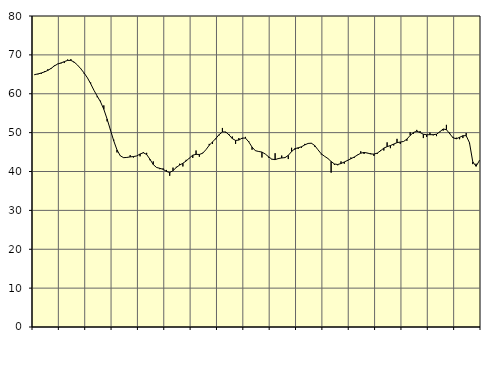
| Category | Piggar | Series 1 |
|---|---|---|
| nan | 64.8 | 64.93 |
| 87.0 | 65 | 65.1 |
| 87.0 | 65.1 | 65.34 |
| 87.0 | 65.8 | 65.62 |
| nan | 66.3 | 66 |
| 88.0 | 66.4 | 66.53 |
| 88.0 | 67.3 | 67.17 |
| 88.0 | 67.7 | 67.65 |
| nan | 67.8 | 67.93 |
| 89.0 | 67.9 | 68.26 |
| 89.0 | 68.8 | 68.58 |
| 89.0 | 68.9 | 68.58 |
| nan | 68 | 68.15 |
| 90.0 | 67.4 | 67.39 |
| 90.0 | 66.5 | 66.44 |
| 90.0 | 65.2 | 65.36 |
| nan | 64.1 | 64.13 |
| 91.0 | 62.9 | 62.59 |
| 91.0 | 60.9 | 60.89 |
| 91.0 | 59.1 | 59.38 |
| nan | 58.2 | 57.92 |
| 92.0 | 57 | 56 |
| 92.0 | 52.9 | 53.49 |
| 92.0 | 50.8 | 50.7 |
| nan | 48.2 | 47.9 |
| 93.0 | 44.9 | 45.55 |
| 93.0 | 44.1 | 44.04 |
| 93.0 | 43.5 | 43.56 |
| nan | 43.6 | 43.62 |
| 94.0 | 44.2 | 43.76 |
| 94.0 | 43.6 | 43.84 |
| 94.0 | 44 | 44.01 |
| nan | 43.9 | 44.5 |
| 95.0 | 45 | 44.82 |
| 95.0 | 44.8 | 44.38 |
| 95.0 | 42.9 | 43.15 |
| nan | 42.6 | 41.79 |
| 96.0 | 41 | 41.04 |
| 96.0 | 40.6 | 40.82 |
| 96.0 | 40.8 | 40.56 |
| nan | 40.4 | 40.03 |
| 97.0 | 38.9 | 39.73 |
| 97.0 | 41 | 40.22 |
| 97.0 | 41.2 | 41.04 |
| nan | 42 | 41.65 |
| 98.0 | 41.3 | 42.12 |
| 98.0 | 43 | 42.71 |
| 98.0 | 43.4 | 43.48 |
| nan | 43.5 | 44.2 |
| 99.0 | 45.4 | 44.41 |
| 99.0 | 43.8 | 44.38 |
| 99.0 | 44.8 | 44.7 |
| nan | 45.6 | 45.61 |
| 0.0 | 47.1 | 46.75 |
| 0.0 | 47.1 | 47.61 |
| 0.0 | 48.3 | 48.49 |
| nan | 49.3 | 49.49 |
| 1.0 | 51.2 | 50.17 |
| 1.0 | 50 | 50.17 |
| 1.0 | 49.6 | 49.42 |
| nan | 49 | 48.47 |
| 2.0 | 47.1 | 47.99 |
| 2.0 | 48.6 | 48.09 |
| 2.0 | 48.4 | 48.6 |
| nan | 48.9 | 48.59 |
| 3.0 | 47.8 | 47.62 |
| 3.0 | 45.6 | 46.28 |
| 3.0 | 45.4 | 45.35 |
| nan | 45.1 | 45.15 |
| 4.0 | 43.6 | 45 |
| 4.0 | 44.5 | 44.5 |
| 4.0 | 43.6 | 43.8 |
| nan | 43.1 | 43.18 |
| 5.0 | 44.7 | 43.05 |
| 5.0 | 43.2 | 43.34 |
| 5.0 | 44.1 | 43.48 |
| nan | 43.5 | 43.57 |
| 6.0 | 43.2 | 44.15 |
| 6.0 | 46.1 | 45.14 |
| 6.0 | 45.6 | 45.87 |
| nan | 45.8 | 46.1 |
| 7.0 | 46.1 | 46.36 |
| 7.0 | 47.1 | 46.83 |
| 7.0 | 47.2 | 47.22 |
| nan | 47.2 | 47.28 |
| 8.0 | 46.4 | 46.7 |
| 8.0 | 45.6 | 45.6 |
| 8.0 | 44.4 | 44.55 |
| nan | 43.9 | 43.92 |
| 9.0 | 43.3 | 43.36 |
| 9.0 | 39.7 | 42.58 |
| 9.0 | 41.7 | 41.94 |
| nan | 41.6 | 41.8 |
| 10.0 | 42.6 | 42.05 |
| 10.0 | 42 | 42.45 |
| 10.0 | 42.7 | 42.86 |
| nan | 43.6 | 43.28 |
| 11.0 | 43.5 | 43.72 |
| 11.0 | 44.3 | 44.23 |
| 11.0 | 45.2 | 44.71 |
| nan | 44.5 | 44.9 |
| 12.0 | 44.7 | 44.76 |
| 12.0 | 44.7 | 44.51 |
| 12.0 | 44 | 44.48 |
| nan | 44.5 | 44.73 |
| 13.0 | 45.5 | 45.32 |
| 13.0 | 45.4 | 46.02 |
| 13.0 | 47.5 | 46.39 |
| nan | 46 | 46.68 |
| 14.0 | 46.7 | 47.05 |
| 14.0 | 48.4 | 47.42 |
| 14.0 | 47.1 | 47.58 |
| nan | 47.7 | 47.72 |
| 15.0 | 47.9 | 48.34 |
| 15.0 | 50.1 | 49.28 |
| 15.0 | 49.7 | 50.04 |
| nan | 50.7 | 50.35 |
| 16.0 | 50.4 | 50.03 |
| 16.0 | 48.6 | 49.59 |
| 16.0 | 48.9 | 49.45 |
| nan | 50 | 49.47 |
| 17.0 | 49.3 | 49.47 |
| 17.0 | 49.1 | 49.59 |
| 17.0 | 50.1 | 50.22 |
| nan | 50.5 | 50.94 |
| 18.0 | 52 | 50.76 |
| 18.0 | 50 | 49.72 |
| 18.0 | 48.9 | 48.68 |
| nan | 48.7 | 48.41 |
| 19.0 | 48.3 | 48.8 |
| 19.0 | 48.6 | 49.2 |
| 19.0 | 49.9 | 49.21 |
| nan | 47.2 | 47.41 |
| 20.0 | 41.9 | 42.51 |
| 20.0 | 42 | 41.34 |
| 20.0 | 42.9 | 42.77 |